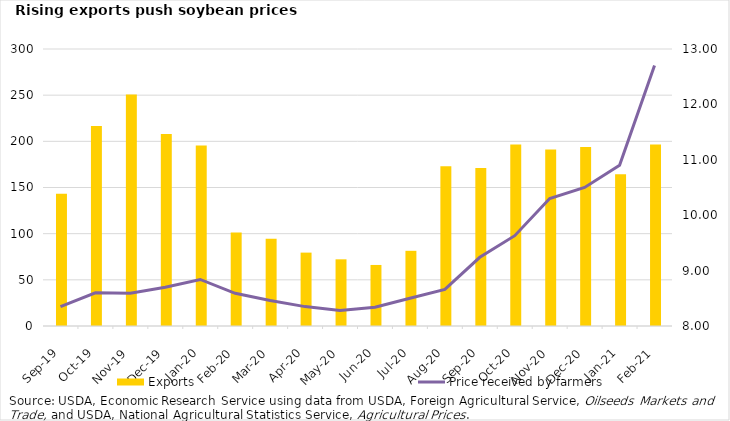
| Category | Exports |
|---|---|
| 2019-09-01 | 143.314 |
| 2019-10-01 | 216.551 |
| 2019-11-01 | 250.802 |
| 2019-12-01 | 207.86 |
| 2020-01-01 | 195.447 |
| 2020-02-01 | 101.371 |
| 2020-03-01 | 94.463 |
| 2020-04-01 | 79.481 |
| 2020-05-01 | 72.216 |
| 2020-06-01 | 66.109 |
| 2020-07-01 | 81.431 |
| 2020-08-01 | 172.978 |
| 2020-09-01 | 171.056 |
| 2020-10-01 | 196.569 |
| 2020-11-01 | 191.04 |
| 2020-12-01 | 193.767 |
| 2021-01-01 | 164.35 |
| 2021-02-01 | 196.512 |